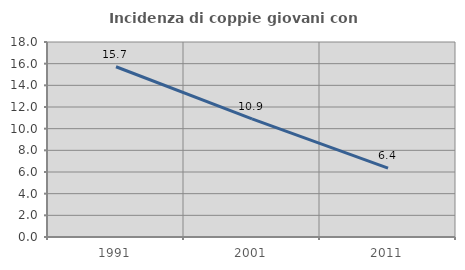
| Category | Incidenza di coppie giovani con figli |
|---|---|
| 1991.0 | 15.718 |
| 2001.0 | 10.909 |
| 2011.0 | 6.364 |